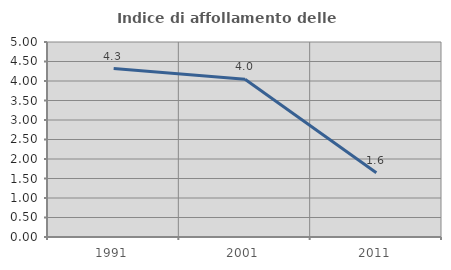
| Category | Indice di affollamento delle abitazioni  |
|---|---|
| 1991.0 | 4.318 |
| 2001.0 | 4.047 |
| 2011.0 | 1.647 |